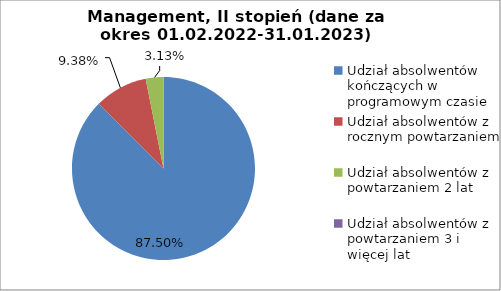
| Category | Series 0 |
|---|---|
| Udział absolwentów kończących w programowym czasie | 87.5 |
| Udział absolwentów z rocznym powtarzaniem | 9.375 |
| Udział absolwentów z powtarzaniem 2 lat | 3.125 |
| Udział absolwentów z powtarzaniem 3 i więcej lat | 0 |